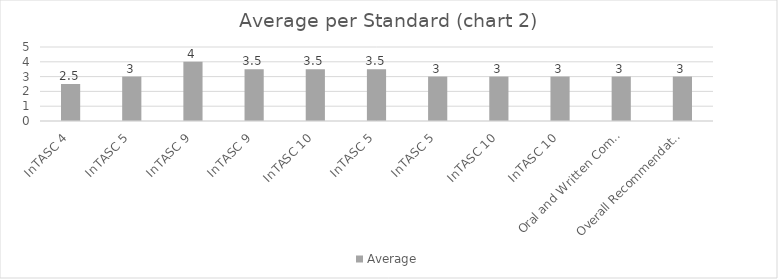
| Category | Average |
|---|---|
| InTASC 4 | 2.5 |
| InTASC 5 | 3 |
| InTASC 9 | 4 |
| InTASC 9 | 3.5 |
| InTASC 10 | 3.5 |
| InTASC 5 | 3.5 |
| InTASC 5 | 3 |
| InTASC 10 | 3 |
| InTASC 10 | 3 |
| Oral and Written Communication | 3 |
| Overall Recommendation | 3 |